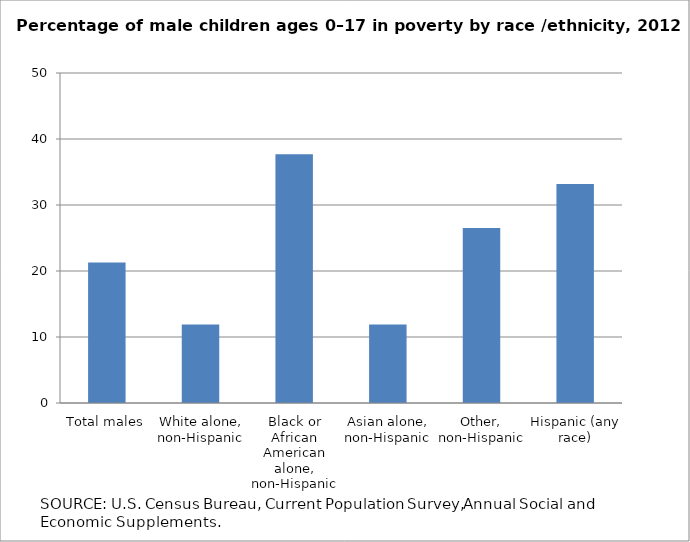
| Category | Series 1 |
|---|---|
| Total males | 21.3 |
| White alone, non-Hispanic | 11.9 |
| Black or African American alone, non-Hispanic | 37.7 |
| Asian alone, non-Hispanic | 11.9 |
| Other, non-Hispanic | 26.5 |
| Hispanic (any race) | 33.2 |